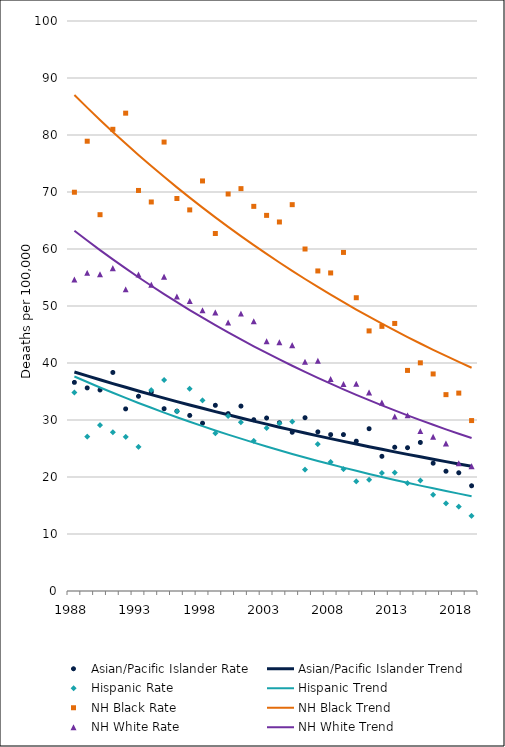
| Category | Asian/Pacific Islander Rate | Asian/Pacific Islander Trend | Hispanic Rate | Hispanic Trend | NH Black Rate | NH Black Trend | NH White Rate | NH White Trend |
|---|---|---|---|---|---|---|---|---|
| 1988.0 | 36.6 | 38.43 | 34.82 | 37.63 | 69.96 | 87.01 | 54.65 | 63.21 |
| 1989.0 | 35.63 | 37.74 | 27.09 | 36.66 | 78.91 | 84.8 | 55.82 | 61.49 |
| 1990.0 | 35.27 | 37.06 | 29.1 | 35.7 | 66.02 | 82.64 | 55.57 | 59.81 |
| 1991.0 | 38.34 | 36.39 | 27.86 | 34.78 | 81 | 80.54 | 56.64 | 58.18 |
| 1992.0 | 31.95 | 35.74 | 27.04 | 33.87 | 83.83 | 78.5 | 52.92 | 56.6 |
| 1993.0 | 34.16 | 35.09 | 25.3 | 32.99 | 70.27 | 76.5 | 55.53 | 55.05 |
| 1994.0 | 34.89 | 34.46 | 35.25 | 32.14 | 68.25 | 74.56 | 53.74 | 53.55 |
| 1995.0 | 31.98 | 33.84 | 37.01 | 31.3 | 78.76 | 72.66 | 55.15 | 52.09 |
| 1996.0 | 31.55 | 33.23 | 31.51 | 30.49 | 68.86 | 70.81 | 51.66 | 50.67 |
| 1997.0 | 30.8 | 32.64 | 35.48 | 29.69 | 66.86 | 69.01 | 50.87 | 49.29 |
| 1998.0 | 29.44 | 32.05 | 33.44 | 28.92 | 71.94 | 67.26 | 49.26 | 47.95 |
| 1999.0 | 32.58 | 31.47 | 27.68 | 28.17 | 62.72 | 65.55 | 48.88 | 46.64 |
| 2000.0 | 31.12 | 30.91 | 30.71 | 27.44 | 69.65 | 63.89 | 47.11 | 45.37 |
| 2001.0 | 32.44 | 30.35 | 29.6 | 26.73 | 70.59 | 62.26 | 48.67 | 44.14 |
| 2002.0 | 30.05 | 29.8 | 26.35 | 26.03 | 67.48 | 60.68 | 47.33 | 42.93 |
| 2003.0 | 30.35 | 29.27 | 28.58 | 25.36 | 65.9 | 59.14 | 43.82 | 41.76 |
| 2004.0 | 29.52 | 28.74 | 29.41 | 24.7 | 64.74 | 57.63 | 43.63 | 40.62 |
| 2005.0 | 27.85 | 28.22 | 29.71 | 24.05 | 67.78 | 56.17 | 43.13 | 39.52 |
| 2006.0 | 30.4 | 27.72 | 21.29 | 23.43 | 60 | 54.74 | 40.22 | 38.44 |
| 2007.0 | 27.92 | 27.22 | 25.77 | 22.82 | 56.15 | 53.35 | 40.4 | 37.39 |
| 2008.0 | 27.44 | 26.73 | 22.63 | 22.23 | 55.8 | 51.99 | 37.19 | 36.37 |
| 2009.0 | 27.44 | 26.25 | 21.37 | 21.65 | 59.4 | 50.67 | 36.31 | 35.38 |
| 2010.0 | 26.29 | 25.78 | 19.24 | 21.09 | 51.45 | 49.38 | 36.35 | 34.42 |
| 2011.0 | 28.47 | 25.31 | 19.51 | 20.54 | 45.63 | 48.13 | 34.84 | 33.48 |
| 2012.0 | 23.63 | 24.86 | 20.7 | 20.01 | 46.43 | 46.91 | 33.07 | 32.57 |
| 2013.0 | 25.22 | 24.41 | 20.76 | 19.49 | 46.94 | 45.71 | 30.62 | 31.68 |
| 2014.0 | 25.14 | 23.97 | 18.91 | 18.98 | 38.7 | 44.55 | 30.82 | 30.82 |
| 2015.0 | 26.06 | 23.54 | 19.4 | 18.49 | 40.03 | 43.42 | 28.05 | 29.98 |
| 2016.0 | 22.42 | 23.12 | 16.89 | 18.01 | 38.08 | 42.32 | 27.06 | 29.16 |
| 2017.0 | 21.01 | 22.7 | 15.36 | 17.54 | 34.45 | 41.24 | 25.89 | 28.36 |
| 2018.0 | 20.74 | 22.29 | 14.8 | 17.08 | 34.72 | 40.19 | 22.42 | 27.59 |
| 2019.0 | 18.46 | 21.89 | 13.18 | 16.64 | 29.9 | 39.17 | 21.9 | 26.84 |